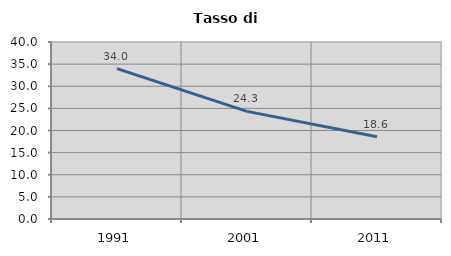
| Category | Tasso di disoccupazione   |
|---|---|
| 1991.0 | 33.993 |
| 2001.0 | 24.325 |
| 2011.0 | 18.593 |